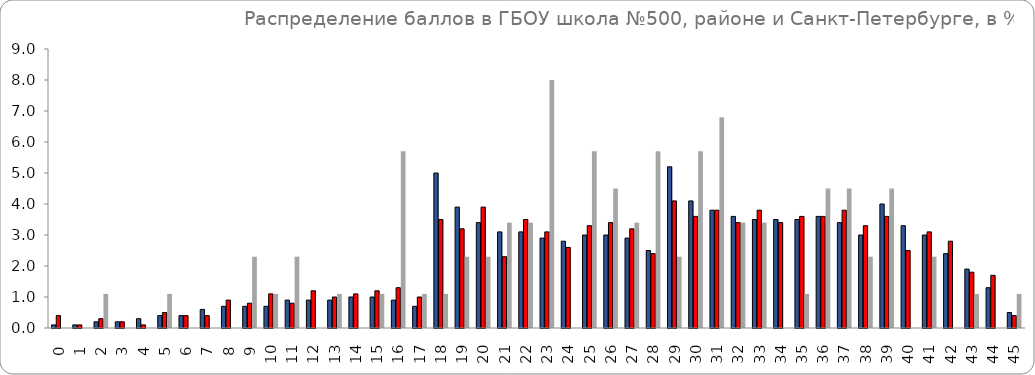
| Category | Series 0 | Series 1 | Series 2 |
|---|---|---|---|
| 0.0 | 0.1 | 0.4 | 0 |
| 1.0 | 0.1 | 0.1 | 0 |
| 2.0 | 0.2 | 0.3 | 1.1 |
| 3.0 | 0.2 | 0.2 | 0 |
| 4.0 | 0.3 | 0.1 | 0 |
| 5.0 | 0.4 | 0.5 | 1.1 |
| 6.0 | 0.4 | 0.4 | 0 |
| 7.0 | 0.6 | 0.4 | 0 |
| 8.0 | 0.7 | 0.9 | 0 |
| 9.0 | 0.7 | 0.8 | 2.3 |
| 10.0 | 0.7 | 1.1 | 1.1 |
| 11.0 | 0.9 | 0.8 | 2.3 |
| 12.0 | 0.9 | 1.2 | 0 |
| 13.0 | 0.9 | 1 | 1.1 |
| 14.0 | 1 | 1.1 | 0 |
| 15.0 | 1 | 1.2 | 1.1 |
| 16.0 | 0.9 | 1.3 | 5.7 |
| 17.0 | 0.7 | 1 | 1.1 |
| 18.0 | 5 | 3.5 | 1.1 |
| 19.0 | 3.9 | 3.2 | 2.3 |
| 20.0 | 3.4 | 3.9 | 2.3 |
| 21.0 | 3.1 | 2.3 | 3.4 |
| 22.0 | 3.1 | 3.5 | 3.4 |
| 23.0 | 2.9 | 3.1 | 8 |
| 24.0 | 2.8 | 2.6 | 0 |
| 25.0 | 3 | 3.3 | 5.7 |
| 26.0 | 3 | 3.4 | 4.5 |
| 27.0 | 2.9 | 3.2 | 3.4 |
| 28.0 | 2.5 | 2.4 | 5.7 |
| 29.0 | 5.2 | 4.1 | 2.3 |
| 30.0 | 4.1 | 3.6 | 5.7 |
| 31.0 | 3.8 | 3.8 | 6.8 |
| 32.0 | 3.6 | 3.4 | 3.4 |
| 33.0 | 3.5 | 3.8 | 3.4 |
| 34.0 | 3.5 | 3.4 | 0 |
| 35.0 | 3.5 | 3.6 | 1.1 |
| 36.0 | 3.6 | 3.6 | 4.5 |
| 37.0 | 3.4 | 3.8 | 4.5 |
| 38.0 | 3 | 3.3 | 2.3 |
| 39.0 | 4 | 3.6 | 4.5 |
| 40.0 | 3.3 | 2.5 | 0 |
| 41.0 | 3 | 3.1 | 2.3 |
| 42.0 | 2.4 | 2.8 | 0 |
| 43.0 | 1.9 | 1.8 | 1.1 |
| 44.0 | 1.3 | 1.7 | 0 |
| 45.0 | 0.5 | 0.4 | 1.1 |